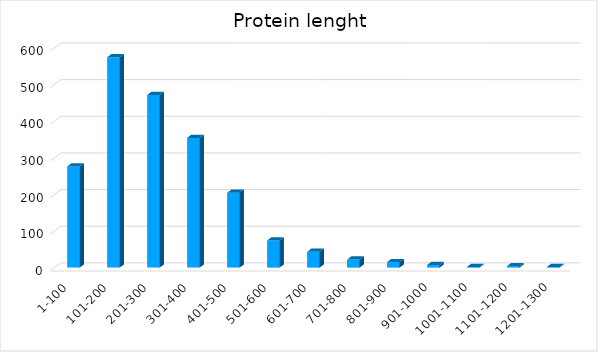
| Category | Series 0 |
|---|---|
| 1-100 | 276 |
| 101-200 | 574 |
| 201-300 | 471 |
| 301-400 | 354 |
| 401-500 | 204 |
| 501-600 | 74 |
| 601-700 | 43 |
| 701-800 | 22 |
| 801-900 | 15 |
| 901-1000 | 7 |
| 1001-1100 | 2 |
| 1101-1200 | 4 |
| 1201-1300 | 2 |